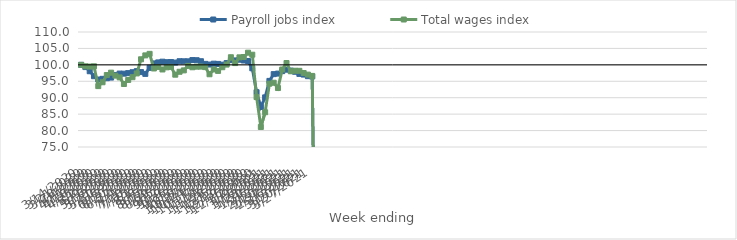
| Category | Payroll jobs index | Total wages index |
|---|---|---|
| 14/03/2020 | 100 | 100 |
| 21/03/2020 | 99.322 | 99.556 |
| 28/03/2020 | 98.057 | 99.474 |
| 04/04/2020 | 96.543 | 99.558 |
| 11/04/2020 | 95.539 | 93.532 |
| 18/04/2020 | 95.744 | 94.706 |
| 25/04/2020 | 95.941 | 96.895 |
| 02/05/2020 | 96.131 | 97.626 |
| 09/05/2020 | 96.92 | 96.72 |
| 16/05/2020 | 97.346 | 96.188 |
| 23/05/2020 | 97.32 | 94.179 |
| 30/05/2020 | 97.486 | 95.414 |
| 06/06/2020 | 97.759 | 96.251 |
| 13/06/2020 | 98.086 | 97.393 |
| 20/06/2020 | 97.796 | 101.694 |
| 27/06/2020 | 97.254 | 102.884 |
| 04/07/2020 | 99.086 | 103.35 |
| 11/07/2020 | 100.443 | 98.9 |
| 18/07/2020 | 100.741 | 99.368 |
| 25/07/2020 | 100.966 | 98.596 |
| 01/08/2020 | 100.812 | 99.246 |
| 08/08/2020 | 100.852 | 99.38 |
| 15/08/2020 | 100.696 | 97.013 |
| 22/08/2020 | 101.107 | 97.898 |
| 29/08/2020 | 101.083 | 98.32 |
| 05/09/2020 | 101.075 | 99.683 |
| 12/09/2020 | 101.457 | 99.262 |
| 19/09/2020 | 101.412 | 99.45 |
| 26/09/2020 | 101.104 | 99.464 |
| 03/10/2020 | 100.3 | 99.315 |
| 10/10/2020 | 100.098 | 97.14 |
| 17/10/2020 | 100.364 | 98.603 |
| 24/10/2020 | 100.289 | 98.162 |
| 31/10/2020 | 100.06 | 99.278 |
| 07/11/2020 | 100.538 | 100.084 |
| 14/11/2020 | 101.424 | 102.318 |
| 21/11/2020 | 101.353 | 100.54 |
| 28/11/2020 | 101.569 | 102.286 |
| 05/12/2020 | 101.33 | 102.388 |
| 12/12/2020 | 101.166 | 103.704 |
| 19/12/2020 | 98.955 | 103.09 |
| 26/12/2020 | 91.679 | 90.195 |
| 02/01/2021 | 87.179 | 81.1 |
| 09/01/2021 | 90.108 | 85.577 |
| 16/01/2021 | 95.118 | 94.27 |
| 23/01/2021 | 97.179 | 94.559 |
| 30/01/2021 | 97.343 | 92.944 |
| 06/02/2021 | 98.091 | 98.582 |
| 13/02/2021 | 98.533 | 100.556 |
| 20/02/2021 | 98.259 | 98.047 |
| 27/02/2021 | 97.892 | 98.21 |
| 06/03/2021 | 97.242 | 98.187 |
| 13/03/2021 | 97.041 | 97.514 |
| 20/03/2021 | 96.552 | 97.031 |
| 27/03/2021 | 96.456 | 96.636 |